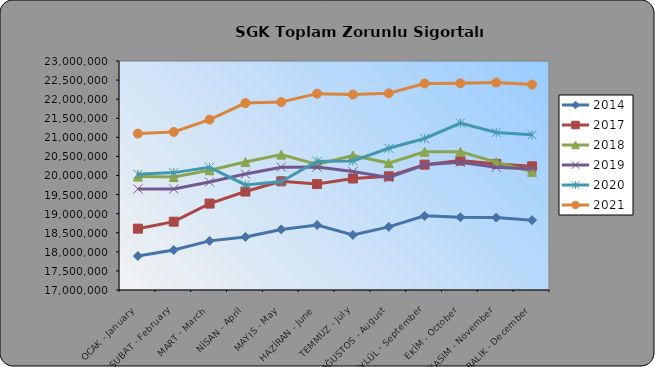
| Category | 2014 | 2017 | 2018 | 2019 | 2020 | 2021 |
|---|---|---|---|---|---|---|
| OCAK - January | 17888850 | 18607120 | 19970763 | 19648900 | 20032004 | 21097678 |
| ŞUBAT - February | 18047588 | 18790237 | 19960009 | 19647886 | 20075675 | 21141033 |
| MART - March | 18287217 | 19263697 | 20137543 | 19828091 | 20214050 | 21464579 |
| NİSAN - April | 18390035 | 19579378 | 20351666 | 20038270 | 19752080 | 21896828 |
| MAYIS - May | 18587161 | 19847694 | 20547739 | 20218472 | 19843495 | 21925160 |
| HAZİRAN - June | 18703323 | 19775804 | 20292691 | 20220807 | 20373446 | 22144897 |
| TEMMUZ - July | 18442224 | 19922088 | 20523586 | 20102816 | 20380102 | 22120535 |
| AĞUSTOS - August | 18653931 | 19979268 | 20325317 | 19945604 | 20713606 | 22152695 |
| EYLÜL - September | 18942797 | 20284445 | 20621914 | 20279720 | 20970323 | 22412059 |
| EKİM - October | 18905822 | 20390228 | 20620417 | 20348058 | 21374683 | 22415773 |
| KASIM - November | 18898806 | 20302716 | 20349347 | 20213823 | 21125594 | 22434929 |
| ARALIK - December | 18829866 | 20241389 | 20093780 | 20172891 | 21064613 | 22382418 |